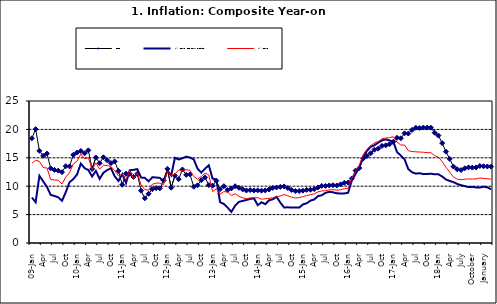
| Category | Food | All Items less Farm Produce | All Items |
|---|---|---|---|
| 09-Jan | 18.436 | 8.013 | 14.034 |
| Feb | 20.041 | 7.178 | 14.584 |
| Mar | 16.233 | 11.842 | 14.366 |
| Apr | 15.342 | 10.85 | 13.268 |
| May | 15.74 | 9.88 | 13.212 |
| June | 13.138 | 8.472 | 11.194 |
| Jul | 12.867 | 8.285 | 11.09 |
| Aug | 12.746 | 8.044 | 11.046 |
| Sep | 12.472 | 7.431 | 10.39 |
| Oct | 13.524 | 8.933 | 11.588 |
| Nov | 13.482 | 10.702 | 12.368 |
| Dec | 15.518 | 11.249 | 13.93 |
| 10-Jan | 15.918 | 12.063 | 14.398 |
| Feb | 16.208 | 13.978 | 15.649 |
| Mar | 15.79 | 13.184 | 14.812 |
| Apr | 16.306 | 12.844 | 15.044 |
| May | 13.023 | 11.711 | 12.915 |
| Jun | 15.053 | 12.686 | 14.099 |
| Jul | 14.043 | 11.287 | 13.002 |
| Aug | 15.09 | 12.366 | 13.702 |
| Sep | 14.57 | 12.83 | 13.65 |
| Oct | 14.065 | 13.168 | 13.45 |
| Nov | 14.351 | 11.746 | 12.766 |
| Dec | 12.701 | 10.917 | 11.815 |
| 11-Jan | 10.255 | 12.118 | 12.08 |
| Feb | 12.221 | 10.569 | 11.1 |
| Mar | 12.169 | 12.815 | 12.779 |
| Apr | 11.629 | 12.882 | 11.291 |
| May | 12.179 | 13.006 | 12.352 |
| Jun | 9.22 | 11.524 | 10.23 |
| Jul | 7.877 | 11.472 | 9.397 |
| Aug | 8.665 | 10.863 | 9.301 |
| Sep | 9.479 | 11.567 | 10.339 |
| Oct | 9.656 | 11.539 | 10.544 |
| Nov | 9.623 | 11.459 | 10.54 |
| Dec | 11.02 | 10.822 | 10.283 |
| 12-Jan | 13.053 | 12.748 | 12.626 |
| 12-Feb | 9.729 | 11.901 | 11.866 |
| 12-Mar | 11.848 | 14.995 | 12.111 |
| Apr | 11.246 | 14.703 | 12.866 |
| May | 12.942 | 14.926 | 12.688 |
| Jun | 11.991 | 15.199 | 12.892 |
| Jul | 12.093 | 15.045 | 12.797 |
| Aug | 9.91 | 14.714 | 11.689 |
| Sep | 10.164 | 13.101 | 11.253 |
| Oct | 11.064 | 12.398 | 11.693 |
| Nov | 11.553 | 13.092 | 12.32 |
| Dec | 10.199 | 13.685 | 11.981 |
| 13-Jan | 10.106 | 11.342 | 9.031 |
| Feb | 10.973 | 11.184 | 9.542 |
| Mar | 9.482 | 7.179 | 8.593 |
| Apr | 10.006 | 6.874 | 9.052 |
| May | 9.321 | 6.227 | 8.964 |
| Jun | 9.606 | 5.472 | 8.353 |
| Jul | 9.994 | 6.58 | 8.682 |
| Aug | 9.723 | 7.245 | 8.231 |
| Sep | 9.437 | 7.41 | 7.952 |
| Oct | 9.249 | 7.579 | 7.807 |
| Nov | 9.313 | 7.75 | 7.931 |
| Dec | 9.253 | 7.872 | 7.957 |
| 14-Jan | 9.271 | 6.648 | 7.977 |
| Feb | 9.207 | 7.166 | 7.707 |
| Mar | 9.254 | 6.836 | 7.783 |
| Apr | 9.414 | 7.508 | 7.851 |
| May | 9.698 | 7.693 | 7.965 |
| Jun | 9.776 | 8.122 | 8.167 |
| Jul | 9.878 | 7.116 | 8.281 |
| Aug | 9.959 | 6.264 | 8.534 |
| Sep | 9.676 | 6.278 | 8.317 |
| Oct | 9.343 | 6.252 | 8.06 |
| Nov | 9.144 | 6.255 | 7.927 |
| Dec | 9.152 | 6.225 | 7.978 |
| 15-Jan | 9.215 | 6.787 | 8.157 |
| Feb | 9.359 | 6.994 | 8.359 |
| Mar | 9.376 | 7.46 | 8.494 |
| Apr | 9.49 | 7.661 | 8.655 |
| May | 9.782 | 8.253 | 9.003 |
| Jun | 10.041 | 8.403 | 9.168 |
| Jul | 10.049 | 8.83 | 9.218 |
| Aug | 10.131 | 9.01 | 9.336 |
| Sep | 10.174 | 8.928 | 9.394 |
| Oct | 10.129 | 8.742 | 9.296 |
| Nov | 10.321 | 8.732 | 9.368 |
| Dec | 10.588 | 8.727 | 9.554 |
| 16-Jan | 10.642 | 8.841 | 9.617 |
| Feb | 11.348 | 11.041 | 11.379 |
| Mar | 12.745 | 12.17 | 12.775 |
| Apr | 13.194 | 13.352 | 13.721 |
| May | 14.861 | 15.054 | 15.577 |
| Jun | 15.302 | 16.224 | 16.48 |
| Jul | 15.799 | 16.929 | 17.127 |
| Aug | 16.427 | 17.208 | 17.609 |
| Sep | 16.622 | 17.666 | 17.852 |
| Oct | 17.09 | 18.067 | 18.33 |
| Nov | 17.191 | 18.241 | 18.476 |
| Dec | 17.388 | 18.052 | 18.547 |
| 17-Jan | 17.818 | 17.867 | 18.719 |
| Feb | 18.528 | 16.011 | 17.78 |
| Mar | 18.436 | 15.404 | 17.256 |
| Apr | 19.303 | 14.75 | 17.244 |
| May | 19.266 | 13.016 | 16.251 |
| Jun | 19.915 | 12.455 | 16.098 |
| Jul | 20.284 | 12.207 | 16.053 |
| Aug | 20.251 | 12.296 | 16.012 |
| Sep | 20.321 | 12.123 | 15.979 |
| Oct | 20.306 | 12.142 | 15.905 |
| Nov | 20.308 | 12.206 | 15.901 |
| Dec | 19.415 | 12.089 | 15.372 |
| 18-Jan | 18.919 | 12.09 | 15.127 |
| Feb | 17.588 | 11.707 | 14.33 |
| Mar | 16.08 | 11.181 | 13.337 |
| Apr | 14.799 | 10.92 | 12.482 |
| May | 13.448 | 10.71 | 11.608 |
| June | 12.977 | 10.387 | 11.231 |
| July | 12.85 | 10.183 | 11.142 |
| August | 13.158 | 10.015 | 11.227 |
| September | 13.309 | 9.838 | 11.284 |
| October | 13.277 | 9.882 | 11.259 |
| November | 13.301 | 9.787 | 11.281 |
| December | 13.559 | 9.771 | 11.442 |
| January | 13.505 | 9.91 | 11.374 |
| February | 13.473 | 9.8 | 11.306 |
| March | 13.451 | 9.461 | 11.251 |